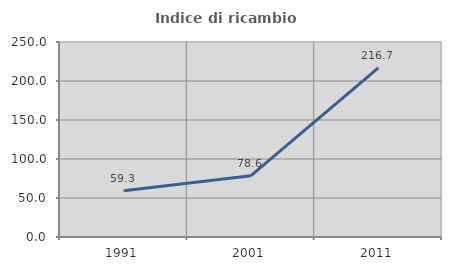
| Category | Indice di ricambio occupazionale  |
|---|---|
| 1991.0 | 59.318 |
| 2001.0 | 78.608 |
| 2011.0 | 216.733 |